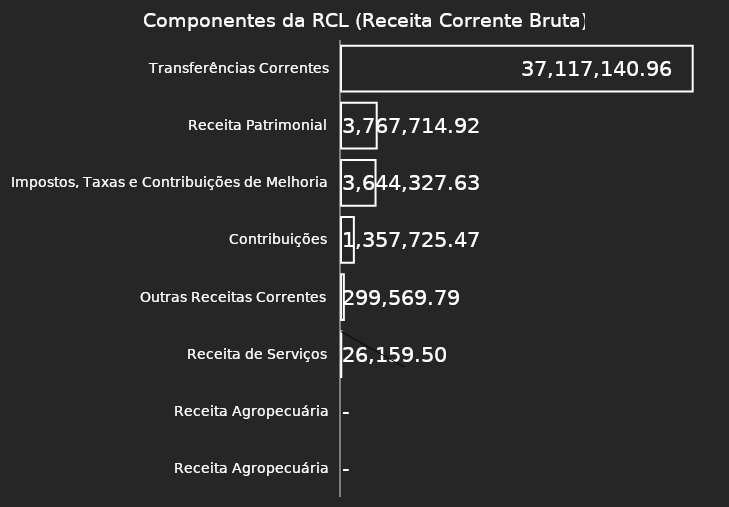
| Category | Valor |
|---|---|
| Transferências Correntes | 37117140.96 |
| Receita Patrimonial | 3767714.92 |
| Impostos, Taxas e Contribuições de Melhoria | 3644327.63 |
| Contribuições | 1357725.47 |
| Outras Receitas Correntes | 299569.79 |
| Receita de Serviços | 26159.5 |
| Receita Agropecuária | 0 |
| Receita Agropecuária | 0 |